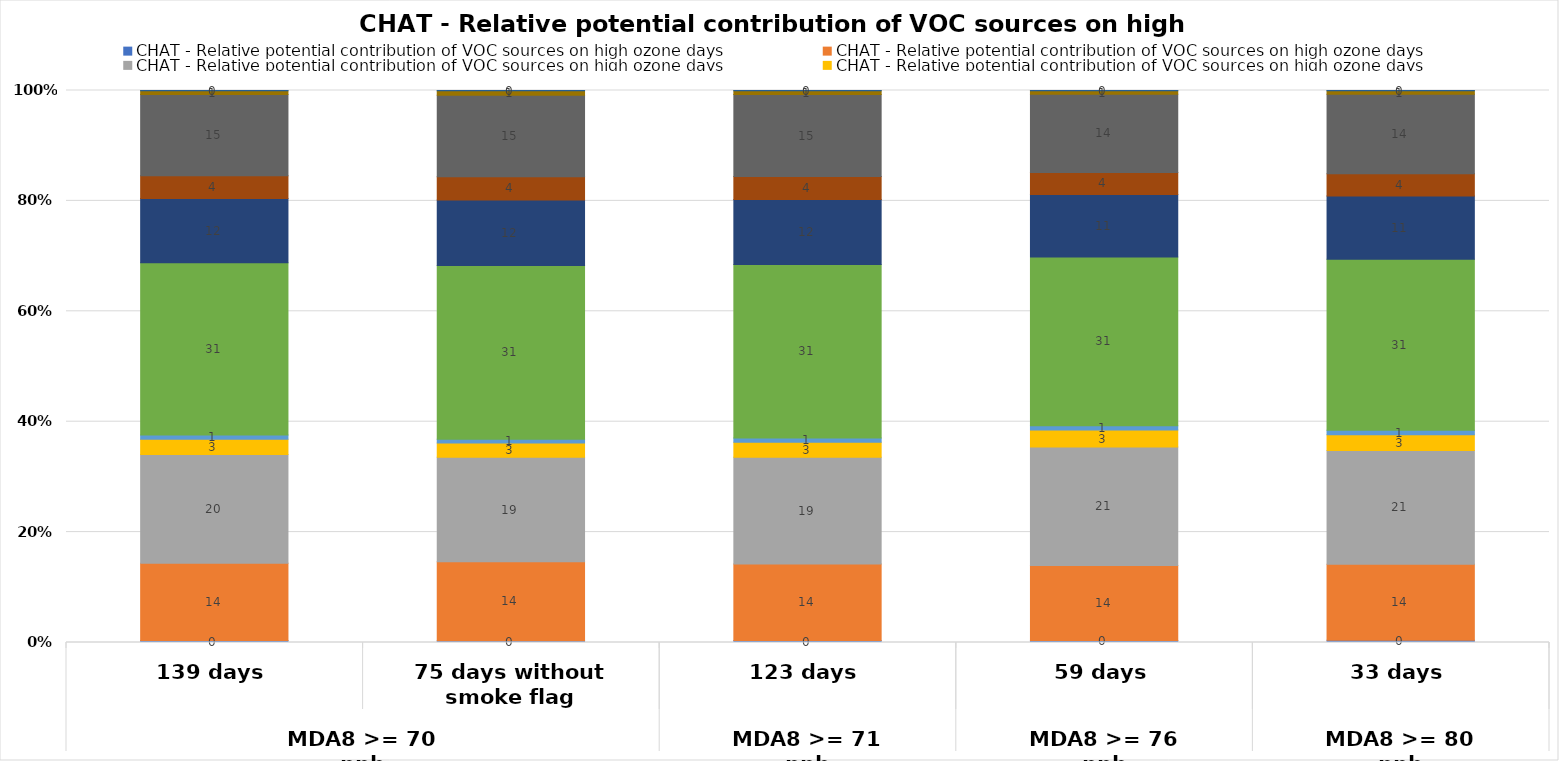
| Category | EGU Point | Non-EGU Point | O&G Area | O&G Point | O&G pre-production | Nonpoint | On-road Mobile | Other Non-road Mobile | Lawn & Garden Equipment | Airports | Rail |
|---|---|---|---|---|---|---|---|---|---|---|---|
| 0 | 0.348 | 14.009 | 19.69 | 2.771 | 0.76 | 31.197 | 11.679 | 4.116 | 14.691 | 0.678 | 0.061 |
| 1 | 0.336 | 14.287 | 18.933 | 2.566 | 0.72 | 31.442 | 11.868 | 4.215 | 14.753 | 0.819 | 0.06 |
| 2 | 0.343 | 13.868 | 19.363 | 2.72 | 0.734 | 31.452 | 11.776 | 4.142 | 14.861 | 0.679 | 0.061 |
| 3 | 0.37 | 13.562 | 21.479 | 3.067 | 0.801 | 30.54 | 11.342 | 3.984 | 14.175 | 0.619 | 0.062 |
| 4 | 0.39 | 13.797 | 20.613 | 2.829 | 0.802 | 30.981 | 11.482 | 4.026 | 14.414 | 0.602 | 0.063 |